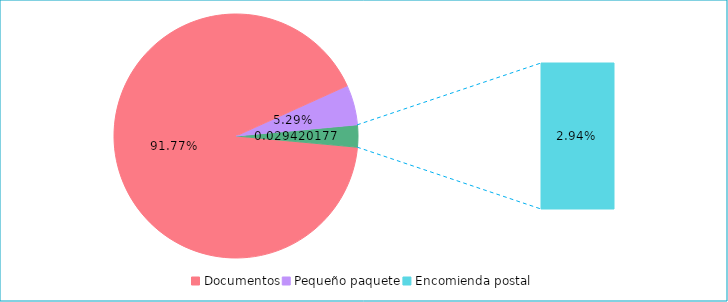
| Category | Series 0 |
|---|---|
| Documentos | 0.918 |
| Pequeño paquete | 0.053 |
| Encomienda postal | 0.029 |